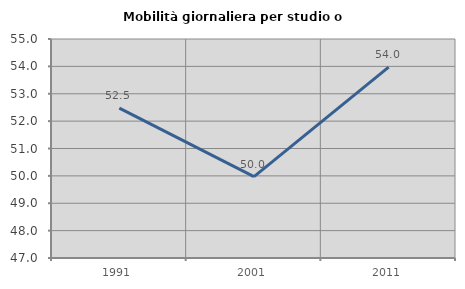
| Category | Mobilità giornaliera per studio o lavoro |
|---|---|
| 1991.0 | 52.477 |
| 2001.0 | 49.975 |
| 2011.0 | 53.971 |